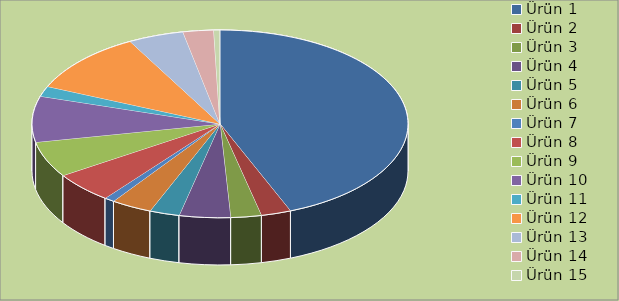
| Category | Series 0 |
|---|---|
| Ürün 1 | 5000 |
| Ürün 2 | 294 |
| Ürün 3 | 300 |
| Ürün 4 | 500 |
| Ürün 5 | 294 |
| Ürün 6 | 400 |
| Ürün 7 | 100 |
| Ürün 8 | 600 |
| Ürün 9 | 700 |
| Ürün 10 | 900 |
| Ürün 11 | 200 |
| Ürün 12 | 1200 |
| Ürün 13 | 544 |
| Ürün 14 | 300 |
| Ürün 15 | 60 |